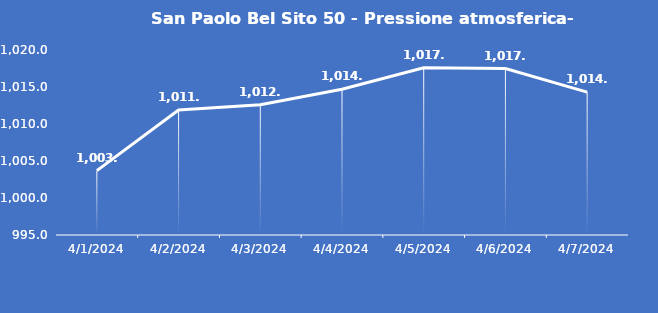
| Category | San Paolo Bel Sito 50 - Pressione atmosferica- Grezzo (hPa) |
|---|---|
| 4/1/24 | 1003.7 |
| 4/2/24 | 1011.9 |
| 4/3/24 | 1012.6 |
| 4/4/24 | 1014.7 |
| 4/5/24 | 1017.6 |
| 4/6/24 | 1017.5 |
| 4/7/24 | 1014.3 |